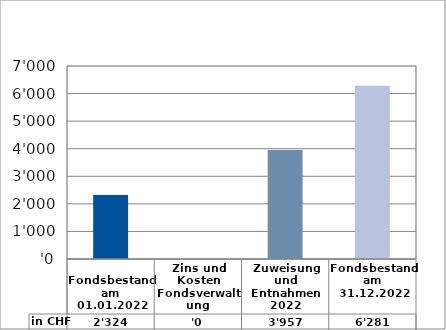
| Category | in CHF |
|---|---|
| 
Fondsbestand am 01.01.2022

 | 2324 |
| Zins und Kosten Fondsverwaltung | 0 |
| Zuweisung und Entnahmen 2022 | 3957 |
| Fondsbestand am 31.12.2022 | 6281 |